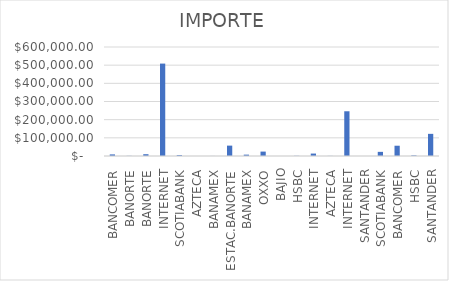
| Category | IMPORTE |
|---|---|
| BANCOMER | 8785.49 |
| BANORTE | 852.28 |
| BANORTE | 9887.48 |
| INTERNET | 508699.45 |
| SCOTIABANK | 5022.54 |
| AZTECA | 92.21 |
| BANAMEX | 292.54 |
| ESTAC.BANORTE | 57105 |
| BANAMEX | 7510.09 |
| OXXO | 24266.47 |
| BAJIO | 63.41 |
| HSBC | 983.16 |
| INTERNET | 13421 |
| AZTECA | 593.82 |
| INTERNET | 246257 |
| SANTANDER | 149.97 |
| SCOTIABANK | 22801.99 |
| BANCOMER | 56562.43 |
| HSBC | 3283.25 |
| SANTANDER | 121931.05 |